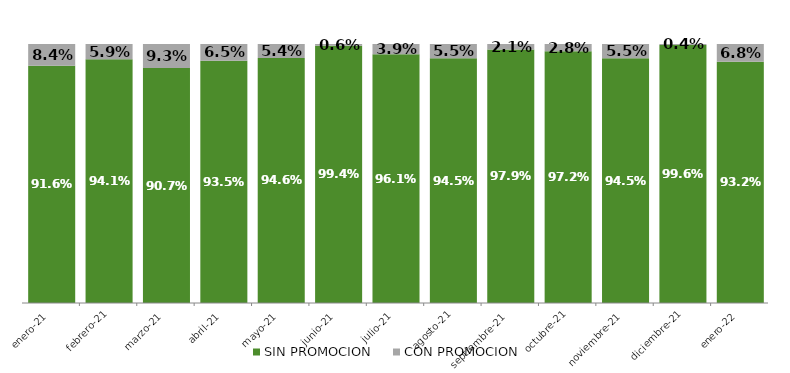
| Category | SIN PROMOCION   | CON PROMOCION   |
|---|---|---|
| 2021-01-01 | 0.916 | 0.084 |
| 2021-02-01 | 0.941 | 0.059 |
| 2021-03-01 | 0.907 | 0.093 |
| 2021-04-01 | 0.935 | 0.065 |
| 2021-05-01 | 0.946 | 0.054 |
| 2021-06-01 | 0.994 | 0.006 |
| 2021-07-01 | 0.961 | 0.039 |
| 2021-08-01 | 0.945 | 0.055 |
| 2021-09-01 | 0.979 | 0.021 |
| 2021-10-01 | 0.972 | 0.028 |
| 2021-11-01 | 0.945 | 0.055 |
| 2021-12-01 | 0.996 | 0.004 |
| 2022-01-01 | 0.932 | 0.068 |